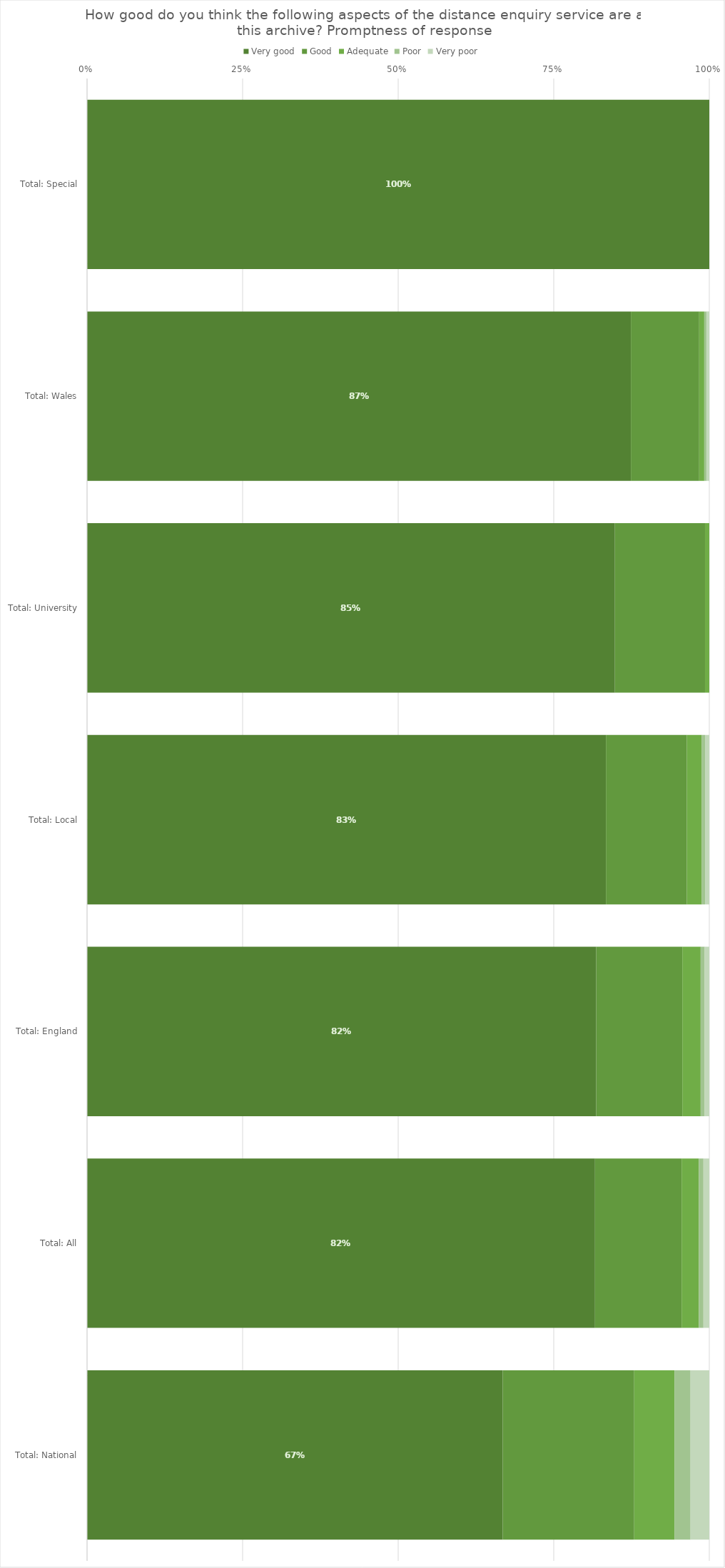
| Category | Very good | Good | Adequate | Poor | Very poor |
|---|---|---|---|---|---|
| Total: Special | 1 | 0 | 0 | 0 | 0 |
| Total: Wales | 0.874 | 0.11 | 0.008 | 0.004 | 0.004 |
| Total: University | 0.848 | 0.145 | 0.007 | 0 | 0 |
| Total: Local | 0.834 | 0.13 | 0.024 | 0.005 | 0.007 |
| Total: England | 0.818 | 0.138 | 0.029 | 0.007 | 0.007 |
| Total: All | 0.816 | 0.139 | 0.028 | 0.008 | 0.009 |
| Total: National | 0.668 | 0.211 | 0.065 | 0.026 | 0.03 |